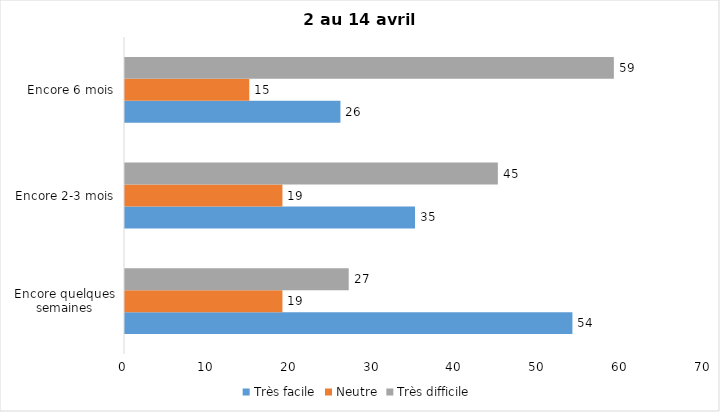
| Category | Très facile | Neutre | Très difficile |
|---|---|---|---|
| Encore quelques semaines | 54 | 19 | 27 |
| Encore 2-3 mois | 35 | 19 | 45 |
| Encore 6 mois | 26 | 15 | 59 |